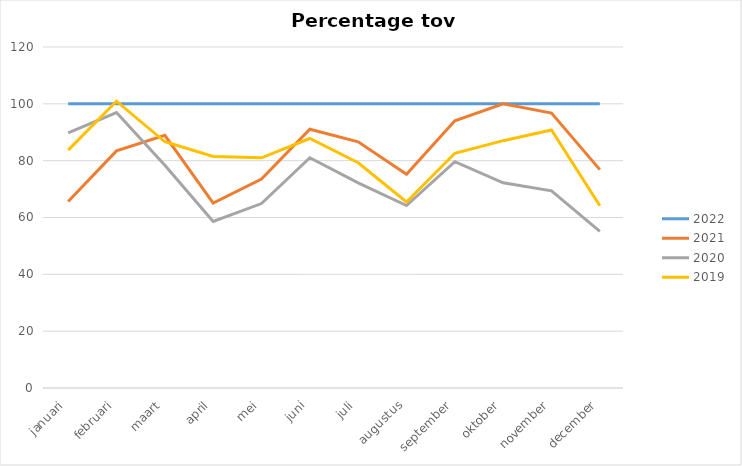
| Category | 2022 | 2021 | 2020 | 2019 |
|---|---|---|---|---|
| januari | 100 | 65.617 | 89.764 | 83.727 |
| februari | 100 | 83.436 | 96.933 | 100.92 |
| maart | 100 | 88.92 | 78.409 | 86.648 |
| april | 100 | 65.039 | 58.612 | 81.491 |
| mei | 100 | 73.558 | 64.904 | 81.01 |
| juni | 100 | 91.057 | 81.03 | 87.805 |
| juli | 100 | 86.648 | 72.159 | 79.261 |
| augustus | 100 | 75.245 | 64.216 | 65.441 |
| september | 100 | 94.022 | 79.62 | 82.609 |
| oktober | 100 | 100 | 72.222 | 87.037 |
| november | 100 | 96.748 | 69.377 | 90.786 |
| december | 100 | 76.844 | 55.123 | 64.139 |